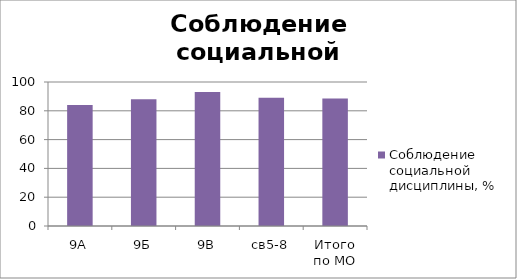
| Category | Соблюдение социальной дисциплины, % |
|---|---|
| 9А | 84 |
| 9Б | 88 |
| 9В | 93 |
| св5-8 | 89 |
| Итого по МО | 88.5 |